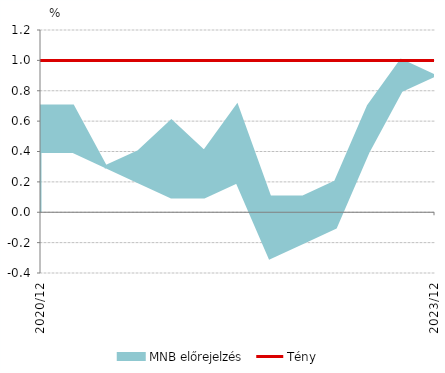
| Category | Tény |
|---|---|
| 2020-12-01 | 1 |
| 2021-03-01 | 1 |
| 2021-06-01 | 1 |
| 2021-09-01 | 1 |
| 2021-12-01 | 1 |
| 2022-03-01 | 1 |
| 2022-06-01 | 1 |
| 2022-09-01 | 1 |
| 2022-12-01 | 1 |
| 2023-03-01 | 1 |
| 2023-06-01 | 1 |
| 2023-09-01 | 1 |
| 2023-12-01 | 1 |